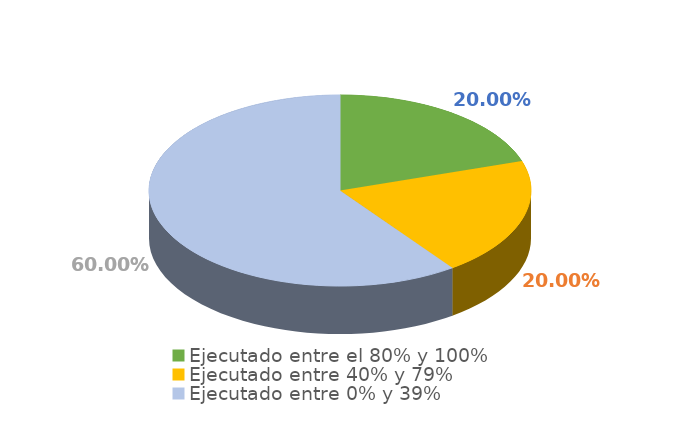
| Category | Series 0 |
|---|---|
| Ejecutado entre el 80% y 100% | 0.2 |
| Ejecutado entre 40% y 79% | 0.2 |
| Ejecutado entre 0% y 39% | 0.6 |